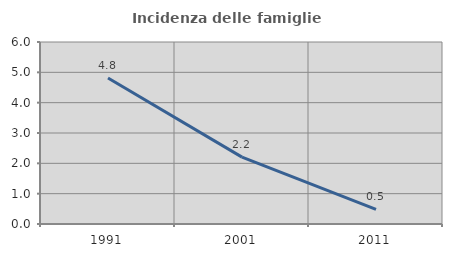
| Category | Incidenza delle famiglie numerose |
|---|---|
| 1991.0 | 4.813 |
| 2001.0 | 2.203 |
| 2011.0 | 0.485 |